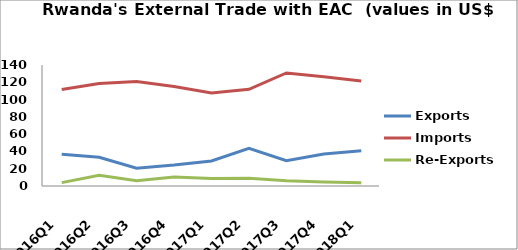
| Category | Exports | Imports | Re-Exports |
|---|---|---|---|
| 2016Q1 | 36.703 | 111.68 | 3.904 |
| 2016Q2 | 33.197 | 118.463 | 12.441 |
| 2016Q3 | 20.47 | 120.843 | 6.13 |
| 2016Q4 | 24.212 | 115.168 | 10.336 |
| 2017Q1 | 28.948 | 107.584 | 8.693 |
| 2017Q2 | 43.559 | 111.838 | 9.044 |
| 2017Q3 | 29.262 | 130.823 | 5.955 |
| 2017Q4 | 36.925 | 126.387 | 4.74 |
| 2018Q1 | 40.765 | 121.477 | 3.856 |